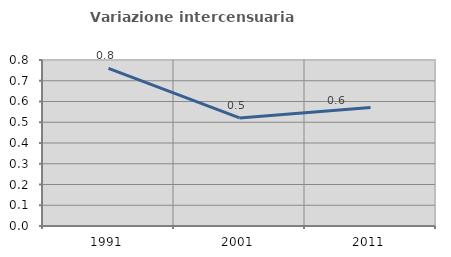
| Category | Variazione intercensuaria annua |
|---|---|
| 1991.0 | 0.76 |
| 2001.0 | 0.521 |
| 2011.0 | 0.571 |